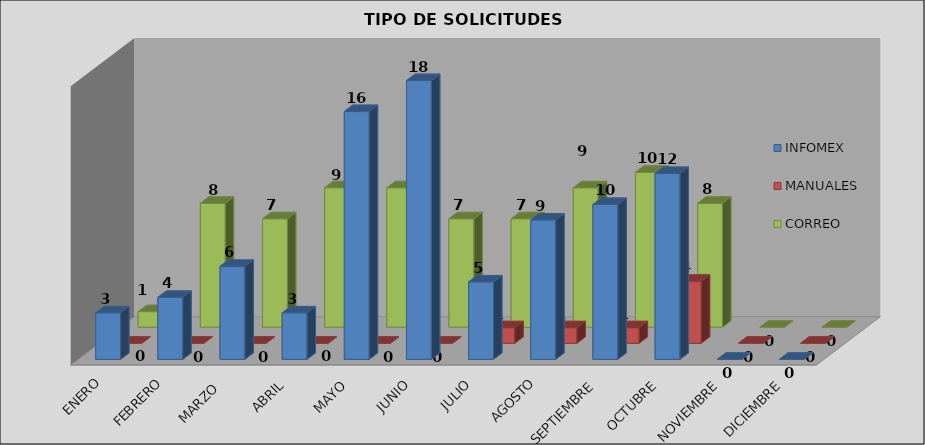
| Category | INFOMEX | MANUALES | CORREO |
|---|---|---|---|
| ENERO | 3 | 0 | 1 |
| FEBRERO | 4 | 0 | 8 |
| MARZO  | 6 | 0 | 7 |
| ABRIL | 3 | 0 | 9 |
| MAYO | 16 | 0 | 9 |
| JUNIO | 18 | 0 | 7 |
| JULIO | 5 | 1 | 7 |
| AGOSTO | 9 | 1 | 9 |
| SEPTIEMBRE | 10 | 1 | 10 |
| OCTUBRE | 12 | 4 | 8 |
| NOVIEMBRE | 0 | 0 | 0 |
| DICIEMBRE | 0 | 0 | 0 |